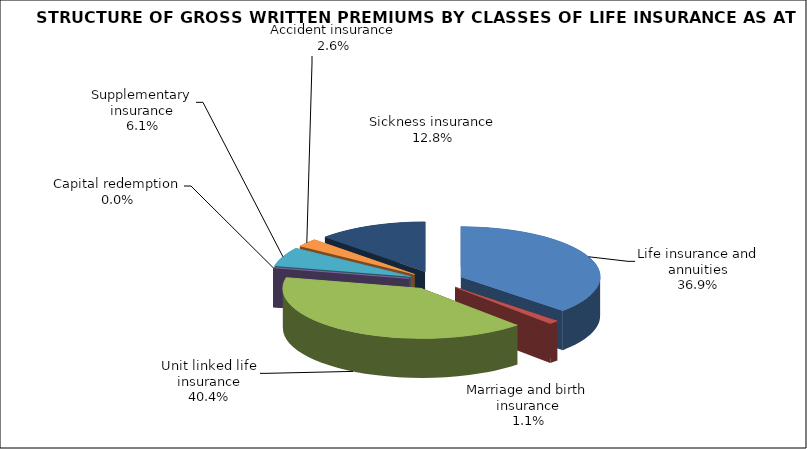
| Category | Life insurance and annuities |
|---|---|
| Life insurance and annuities | 224212625.106 |
| Marriage and birth insurance | 6863303.934 |
| Unit linked life insurance | 245615033.845 |
| Capital redemption | 0 |
| Supplementary insurance | 37251571.787 |
| Accident insurance | 15966082.154 |
| Sickness insurance | 77560542.27 |